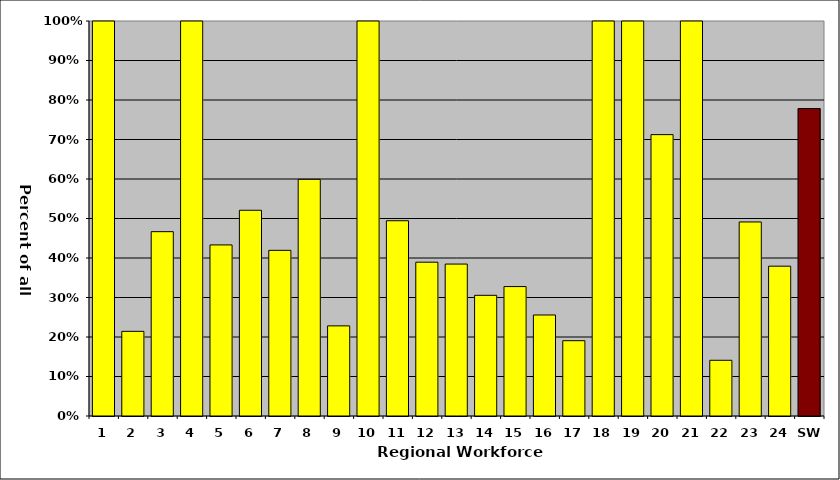
| Category | Series 0 |
|---|---|
| 1 | 1.014 |
| 2 | 0.214 |
| 3 | 0.467 |
| 4 | 4.913 |
| 5 | 0.433 |
| 6 | 0.521 |
| 7 | 0.419 |
| 8 | 0.599 |
| 9 | 0.228 |
| 10 | 1.343 |
| 11 | 0.494 |
| 12 | 0.389 |
| 13 | 0.385 |
| 14 | 0.306 |
| 15 | 0.328 |
| 16 | 0.256 |
| 17 | 0.191 |
| 18 | 1.178 |
| 19 | 15.194 |
| 20 | 0.712 |
| 21 | 6.962 |
| 22 | 0.141 |
| 23 | 0.491 |
| 24 | 0.379 |
| SW | 0.778 |